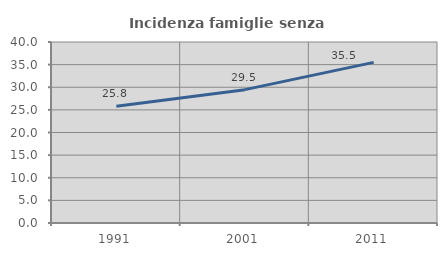
| Category | Incidenza famiglie senza nuclei |
|---|---|
| 1991.0 | 25.786 |
| 2001.0 | 29.469 |
| 2011.0 | 35.501 |